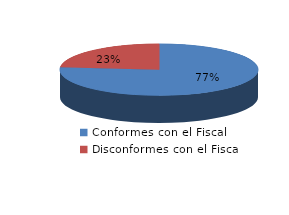
| Category | Series 0 |
|---|---|
| 0 | 738 |
| 1 | 226 |